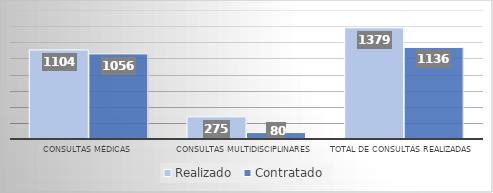
| Category | Realizado | Contratado |
|---|---|---|
| Consultas Médicas | 1104 | 1056 |
| Consultas Multidisciplinares | 275 | 80 |
| Total de Consultas Realizadas | 1379 | 1136 |